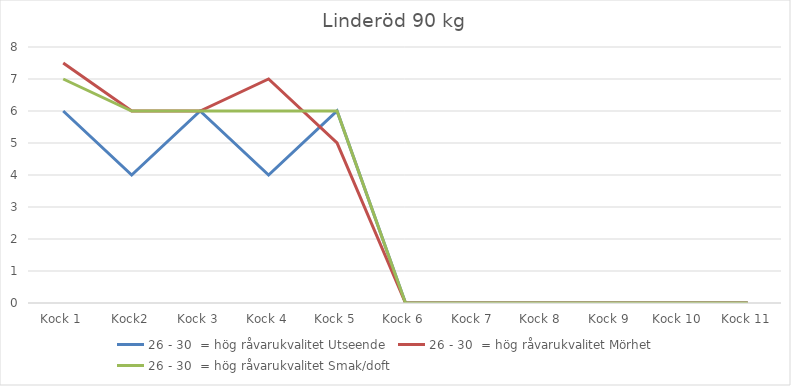
| Category | 26 - 30  = hög råvarukvalitet Utseende | 26 - 30  = hög råvarukvalitet Mörhet | 26 - 30  = hög råvarukvalitet Smak/doft |
|---|---|---|---|
| Kock 1 | 6 | 7.5 | 7 |
| Kock2 | 4 | 6 | 6 |
| Kock 3 | 6 | 6 | 6 |
| Kock 4 | 4 | 7 | 6 |
| Kock 5 | 6 | 5 | 6 |
| Kock 6 | 0 | 0 | 0 |
| Kock 7 | 0 | 0 | 0 |
| Kock 8 | 0 | 0 | 0 |
| Kock 9 | 0 | 0 | 0 |
| Kock 10 | 0 | 0 | 0 |
| Kock 11 | 0 | 0 | 0 |